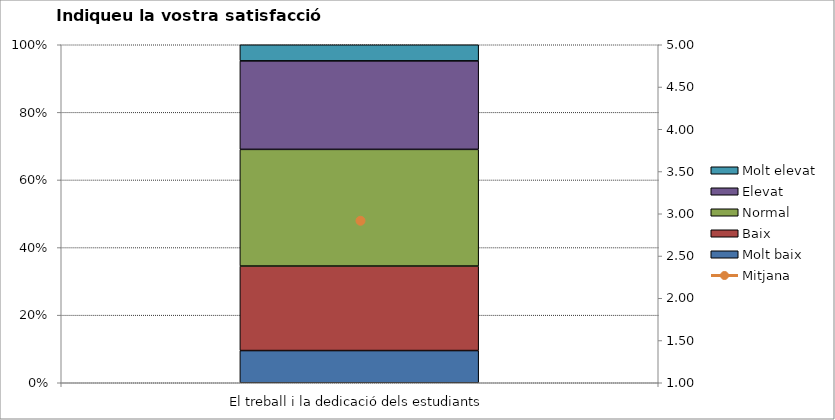
| Category | Molt baix | Baix | Normal  | Elevat | Molt elevat |
|---|---|---|---|---|---|
| El treball i la dedicació dels estudiants | 8 | 21 | 29 | 22 | 4 |